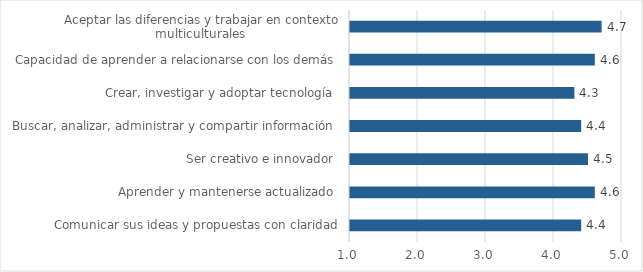
| Category | Series 5 | Promedio |
|---|---|---|
| Comunicar sus ideas y propuestas con claridad |  | 4.4 |
| Aprender y mantenerse actualizado  |  | 4.6 |
| Ser creativo e innovador  |  | 4.5 |
| Buscar, analizar, administrar y compartir información  |  | 4.4 |
| Crear, investigar y adoptar tecnología  |  | 4.3 |
| Capacidad de aprender a relacionarse con los demás  |  | 4.6 |
| Aceptar las diferencias y trabajar en contexto multiculturales  |  | 4.7 |